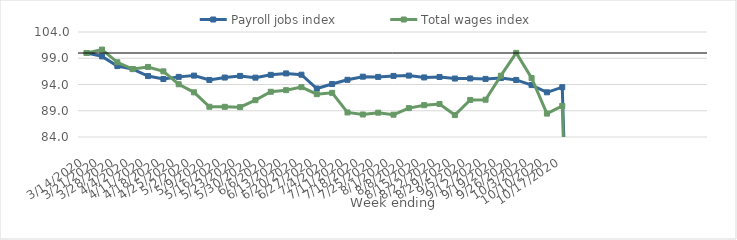
| Category | Payroll jobs index | Total wages index |
|---|---|---|
| 14/03/2020 | 100 | 100 |
| 21/03/2020 | 99.356 | 100.657 |
| 28/03/2020 | 97.507 | 98.228 |
| 04/04/2020 | 96.93 | 96.95 |
| 11/04/2020 | 95.602 | 97.34 |
| 18/04/2020 | 95.044 | 96.504 |
| 25/04/2020 | 95.452 | 94.044 |
| 02/05/2020 | 95.694 | 92.507 |
| 09/05/2020 | 94.868 | 89.757 |
| 16/05/2020 | 95.325 | 89.75 |
| 23/05/2020 | 95.639 | 89.683 |
| 30/05/2020 | 95.305 | 91.017 |
| 06/06/2020 | 95.839 | 92.616 |
| 13/06/2020 | 96.111 | 92.923 |
| 20/06/2020 | 95.865 | 93.498 |
| 27/06/2020 | 93.233 | 92.156 |
| 04/07/2020 | 94.084 | 92.408 |
| 11/07/2020 | 94.894 | 88.673 |
| 18/07/2020 | 95.49 | 88.286 |
| 25/07/2020 | 95.444 | 88.637 |
| 01/08/2020 | 95.635 | 88.246 |
| 08/08/2020 | 95.697 | 89.501 |
| 15/08/2020 | 95.344 | 90.062 |
| 22/08/2020 | 95.426 | 90.297 |
| 29/08/2020 | 95.135 | 88.174 |
| 05/09/2020 | 95.146 | 91.06 |
| 12/09/2020 | 95.066 | 91.102 |
| 19/09/2020 | 95.221 | 95.678 |
| 26/09/2020 | 94.868 | 100.028 |
| 03/10/2020 | 93.888 | 95.24 |
| 10/10/2020 | 92.514 | 88.458 |
| 17/10/2020 | 93.486 | 89.925 |